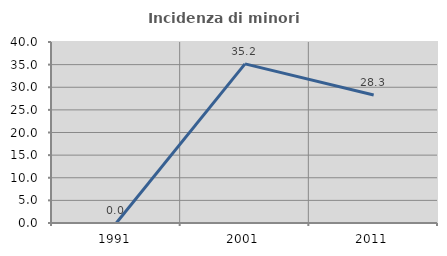
| Category | Incidenza di minori stranieri |
|---|---|
| 1991.0 | 0 |
| 2001.0 | 35.165 |
| 2011.0 | 28.283 |